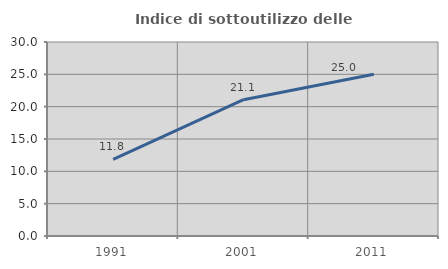
| Category | Indice di sottoutilizzo delle abitazioni  |
|---|---|
| 1991.0 | 11.834 |
| 2001.0 | 21.084 |
| 2011.0 | 25 |